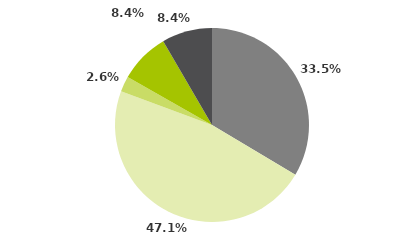
| Category | Series 0 |
|---|---|
| Multimercados Macro | 0.335 |
| Multimercados Livre | 0.471 |
| Multimercados L/S - Neutro | 0.026 |
| Multimercados L/S - Direcional | 0.084 |
| Outros | 0.084 |